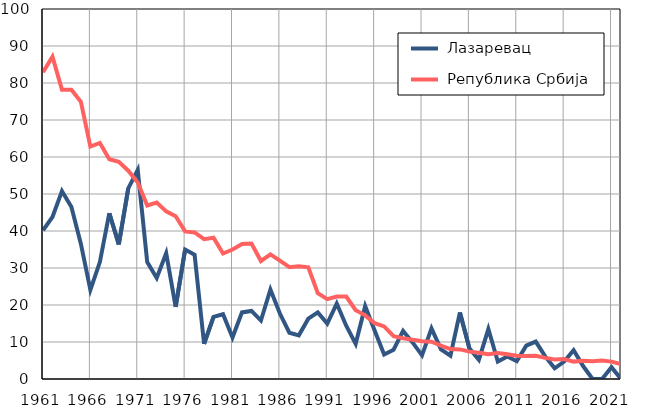
| Category |  Лазаревац |  Република Србија |
|---|---|---|
| 1961.0 | 40.2 | 82.9 |
| 1962.0 | 43.8 | 87.1 |
| 1963.0 | 50.8 | 78.2 |
| 1964.0 | 46.5 | 78.2 |
| 1965.0 | 36.5 | 74.9 |
| 1966.0 | 24.1 | 62.8 |
| 1967.0 | 31.6 | 63.8 |
| 1968.0 | 44.8 | 59.4 |
| 1969.0 | 36.4 | 58.7 |
| 1970.0 | 51.5 | 56.3 |
| 1971.0 | 56.5 | 53.1 |
| 1972.0 | 31.6 | 46.9 |
| 1973.0 | 27.3 | 47.7 |
| 1974.0 | 34 | 45.3 |
| 1975.0 | 19.5 | 44 |
| 1976.0 | 35 | 39.9 |
| 1977.0 | 33.6 | 39.6 |
| 1978.0 | 9.5 | 37.8 |
| 1979.0 | 16.8 | 38.2 |
| 1980.0 | 17.5 | 33.9 |
| 1981.0 | 11.2 | 35 |
| 1982.0 | 18 | 36.5 |
| 1983.0 | 18.4 | 36.6 |
| 1984.0 | 15.8 | 31.9 |
| 1985.0 | 24.2 | 33.7 |
| 1986.0 | 17.7 | 32 |
| 1987.0 | 12.5 | 30.2 |
| 1988.0 | 11.8 | 30.5 |
| 1989.0 | 16.3 | 30.2 |
| 1990.0 | 18 | 23.2 |
| 1991.0 | 15 | 21.6 |
| 1992.0 | 20.4 | 22.3 |
| 1993.0 | 14.4 | 22.3 |
| 1994.0 | 9.5 | 18.6 |
| 1995.0 | 19.7 | 17.2 |
| 1996.0 | 13.1 | 15.1 |
| 1997.0 | 6.6 | 14.2 |
| 1998.0 | 7.9 | 11.6 |
| 1999.0 | 13 | 11 |
| 2000.0 | 9.9 | 10.6 |
| 2001.0 | 6.4 | 10.2 |
| 2002.0 | 13.7 | 10.1 |
| 2003.0 | 8 | 9 |
| 2004.0 | 6.3 | 8.1 |
| 2005.0 | 18 | 8 |
| 2006.0 | 8.3 | 7.4 |
| 2007.0 | 5.2 | 7.1 |
| 2008.0 | 13.5 | 6.7 |
| 2009.0 | 4.7 | 7 |
| 2010.0 | 6.1 | 6.7 |
| 2011.0 | 4.8 | 6.3 |
| 2012.0 | 9 | 6.2 |
| 2013.0 | 10.1 | 6.3 |
| 2014.0 | 6.1 | 5.7 |
| 2015.0 | 2.9 | 5.3 |
| 2016.0 | 4.7 | 5.4 |
| 2017.0 | 7.8 | 4.7 |
| 2018.0 | 3.5 | 4.9 |
| 2019.0 | 0 | 4.8 |
| 2020.0 | 0 | 5 |
| 2021.0 | 3.2 | 4.7 |
| 2022.0 | 0 | 4 |